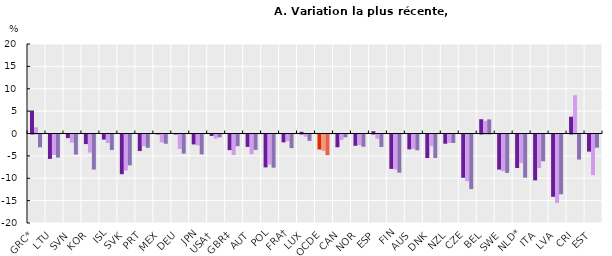
| Category | Faible rémunération | Rémunération intermédiaire | Rémunération élevée |
|---|---|---|---|
| GRC* | 5.14 | 1.404 | -2.852 |
| LTU | -5.456 | -4.577 | -5.157 |
| SVN | -0.812 | -1.812 | -4.494 |
| KOR | -2.141 | -4.056 | -7.844 |
| ISL | -1.133 | -1.893 | -3.474 |
| SVK | -8.878 | -8.066 | -6.902 |
| PRT | -3.699 | -2.596 | -2.974 |
| MEX | 0.044 | -1.75 | -2.068 |
| DEU | 0.074 | -3.215 | -4.287 |
| JPN | -2.221 | -2.433 | -4.443 |
| USA† | -0.333 | -0.912 | -0.634 |
| GBR‡ | -3.498 | -4.608 | -2.614 |
| AUT | -2.768 | -4.425 | -3.44 |
| POL | -7.35 | -6.729 | -7.411 |
| FRA† | -1.759 | -1.481 | -3.046 |
| LUX | 0.376 | -0.495 | -1.421 |
| OCDE | -3.343 | -3.655 | -4.631 |
| CAN | -2.843 | -1.241 | -0.624 |
| NOR | -2.515 | -2.365 | -2.736 |
| ESP | 0.512 | -0.961 | -2.799 |
| FIN | -7.688 | -7.84 | -8.536 |
| AUS | -3.326 | -3.2 | -3.524 |
| DNK | -5.251 | -2.636 | -5.254 |
| NZL | -2.061 | -1.869 | -1.896 |
| CZE | -9.678 | -10.45 | -12.195 |
| BEL | 3.196 | 2.821 | 3.152 |
| SWE | -7.848 | -8.222 | -8.584 |
| NLD* | -7.482 | -6.361 | -9.651 |
| ITA | -10.253 | -7.511 | -5.969 |
| LVA | -13.918 | -15.297 | -13.356 |
| CRI | 3.755 | 8.553 | -5.607 |
| EST | -3.824 | -9.087 | -2.936 |